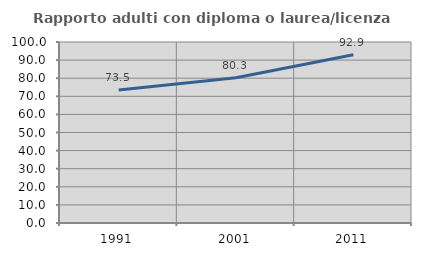
| Category | Rapporto adulti con diploma o laurea/licenza media  |
|---|---|
| 1991.0 | 73.526 |
| 2001.0 | 80.3 |
| 2011.0 | 92.911 |